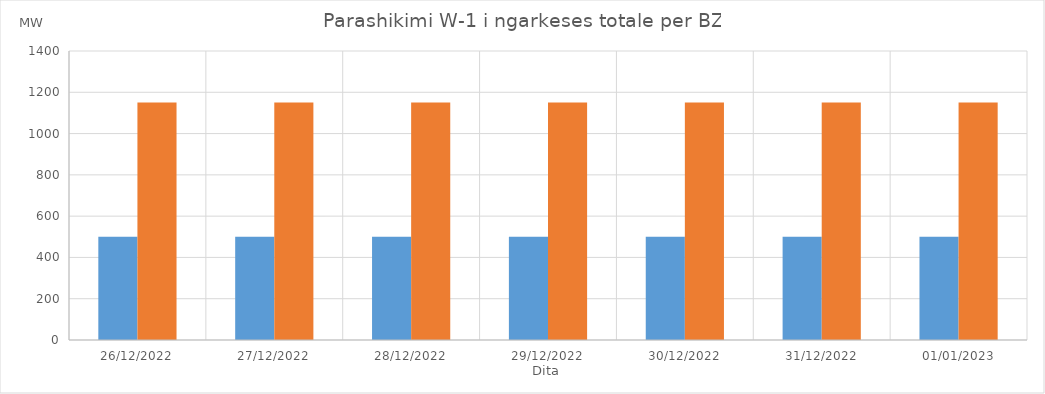
| Category | Min (MW) | Max (MW) |
|---|---|---|
| 26/12/2022 | 500 | 1150 |
| 27/12/2022 | 500 | 1150 |
| 28/12/2022 | 500 | 1150 |
| 29/12/2022 | 500 | 1150 |
| 30/12/2022 | 500 | 1150 |
| 31/12/2022 | 500 | 1150 |
| 01/01/2023 | 500 | 1150 |